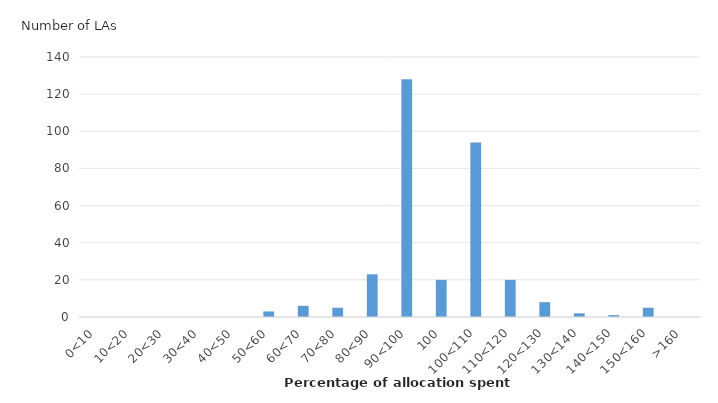
| Category | Number of LAs |
|---|---|
| 0<10 | 0 |
| 10<20 | 0 |
| 20<30 | 0 |
| 30<40 | 0 |
| 40<50 | 0 |
| 50<60 | 3 |
| 60<70 | 6 |
| 70<80 | 5 |
| 80<90 | 23 |
| 90<100 | 128 |
| 100 | 20 |
| 100<110 | 94 |
| 110<120 | 20 |
| 120<130 | 8 |
| 130<140 | 2 |
| 140<150 | 1 |
| 150<160 | 5 |
| >160 | 0 |